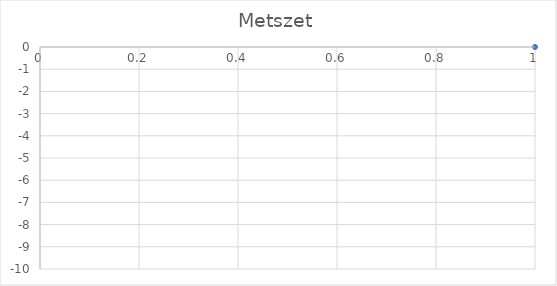
| Category | Series 0 |
|---|---|
| 0 | 0 |
| 1 | 0 |
| 2 | -1 |
| 3 | -1 |
| 4 | -6 |
| 5 | -7 |
| 6 | -3 |
| 7 | -5 |
| 8 | -7 |
| 9 | -6 |
| 10 | -3 |
| 11 | -7 |
| 12 | -2 |
| 13 | -3 |
| 14 | -5 |
| 15 | -6 |
| 16 | -3 |
| 17 | -3 |
| 18 | -4 |
| 19 | -5 |
| 20 | -8 |
| 21 | -6 |
| 22 | -6 |
| 23 | -6 |
| 24 | -7 |
| 25 | -6 |
| 26 | -7 |
| 27 | -9 |
| 28 | -6 |
| 29 | -8 |
| 30 | -9 |
| 31 | -8 |
| 32 | -8 |
| 33 | -6 |
| 34 | -3 |
| 35 | -1 |
| 36 | -1 |
| 37 | -4 |
| 38 | -4 |
| 39 | -1 |
| 40 | 0 |
| 41 | 0 |